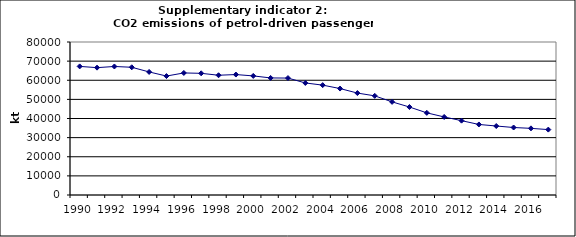
| Category | CO2 emissions of petrol-driven passenger cars, kt |
|---|---|
| 1990 | 67241.004 |
| 1991 | 66587.492 |
| 1992 | 67203.654 |
| 1993 | 66787.489 |
| 1994 | 64349.382 |
| 1995 | 62193.805 |
| 1996 | 63819.579 |
| 1997 | 63621.4 |
| 1998 | 62617.223 |
| 1999 | 62980.273 |
| 2000 | 62269.234 |
| 2001 | 61215.933 |
| 2002 | 61141.061 |
| 2003 | 58591.201 |
| 2004 | 57443.714 |
| 2005 | 55654.074 |
| 2006 | 53298.476 |
| 2007 | 51842.483 |
| 2008 | 48693.524 |
| 2009 | 45998.191 |
| 2010 | 42954.495 |
| 2011 | 40812.286 |
| 2012 | 38872.248 |
| 2013 | 36884.326 |
| 2014 | 36072.628 |
| 2015 | 35289.512 |
| 2016 | 34852.415 |
| 2017 | 34192.305 |